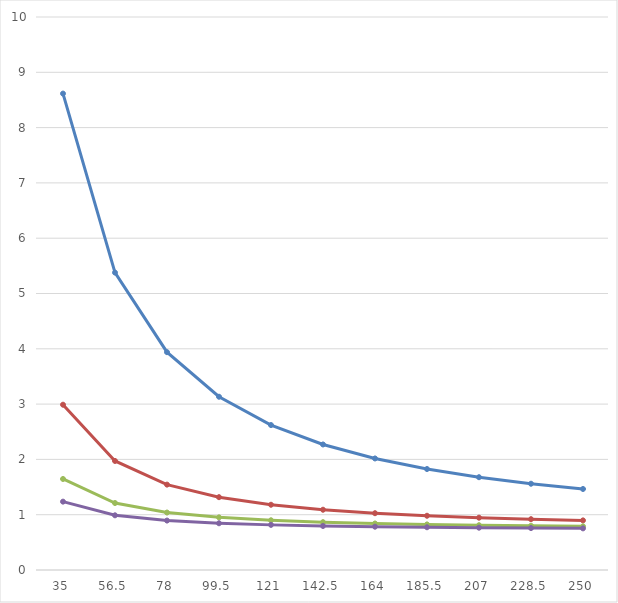
| Category | 0,3 | 0,5 | 0,7 | 0.9 |
|---|---|---|---|---|
| 35.0 | 8.615 | 2.989 | 1.646 | 1.236 |
| 56.5 | 5.378 | 1.972 | 1.211 | 0.989 |
| 78.0 | 3.939 | 1.544 | 1.039 | 0.894 |
| 99.5 | 3.133 | 1.317 | 0.952 | 0.845 |
| 121.0 | 2.621 | 1.18 | 0.899 | 0.816 |
| 142.5 | 2.27 | 1.09 | 0.865 | 0.796 |
| 164.0 | 2.017 | 1.027 | 0.841 | 0.783 |
| 185.5 | 1.826 | 0.981 | 0.824 | 0.773 |
| 207.0 | 1.678 | 0.946 | 0.81 | 0.765 |
| 228.5 | 1.56 | 0.919 | 0.8 | 0.758 |
| 250.0 | 1.465 | 0.897 | 0.79 | 0.753 |